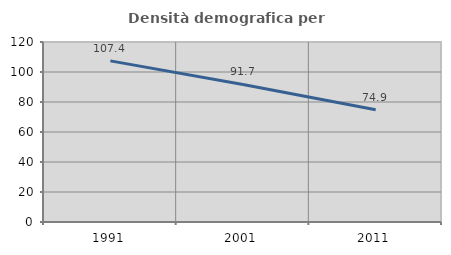
| Category | Densità demografica |
|---|---|
| 1991.0 | 107.422 |
| 2001.0 | 91.675 |
| 2011.0 | 74.898 |